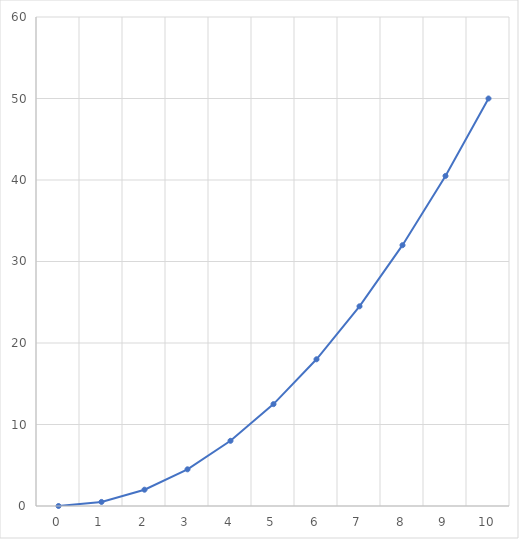
| Category | Series 0 |
|---|---|
| 0.0 | 0 |
| 1.0 | 0.5 |
| 2.0 | 2 |
| 3.0 | 4.5 |
| 4.0 | 8 |
| 5.0 | 12.5 |
| 6.0 | 18 |
| 7.0 | 24.5 |
| 8.0 | 32 |
| 9.0 | 40.5 |
| 10.0 | 50 |